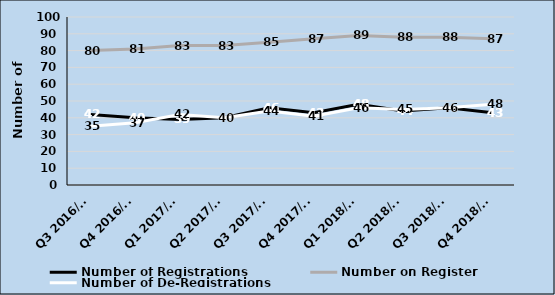
| Category | Number of Registrations | Number on Register | Number of De-Registrations |
|---|---|---|---|
| Q3 2016/17 | 42 | 80 | 35 |
| Q4 2016/17 | 40 | 81 | 37 |
| Q1 2017/18 | 39 | 83 | 42 |
| Q2 2017/18 | 40 | 83 | 40 |
| Q3 2017/18 | 46 | 85 | 44 |
| Q4 2017/18 | 43 | 87 | 41 |
| Q1 2018/19 | 48 | 89 | 46 |
| Q2 2018/19 | 44 | 88 | 45 |
| Q3 2018/19 | 46 | 88 | 46 |
| Q4 2018/19 | 43 | 87 | 48 |